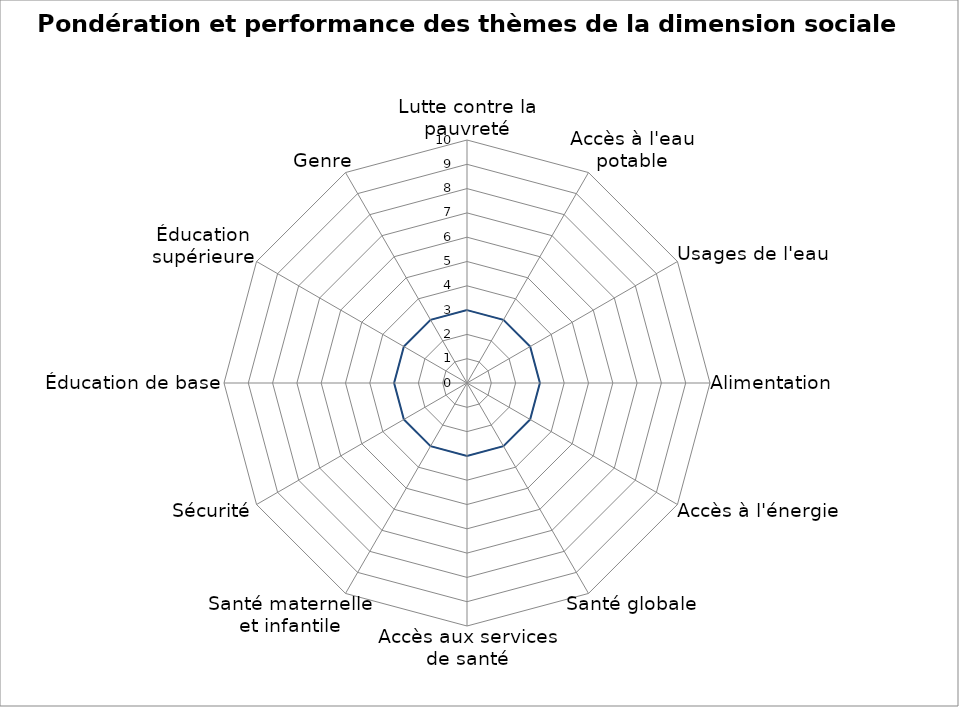
| Category | Performance | Pondération | Series 2 |
|---|---|---|---|
| Lutte contre la pauvreté | 0 | 0 | 3 |
| Accès à l'eau potable | 0 | 0 | 3 |
| Usages de l'eau | 0 | 0 | 3 |
| Alimentation | 0 | 0 | 3 |
| Accès à l'énergie | 0 | 0 | 3 |
| Santé globale | 0 | 0 | 3 |
| Accès aux services de santé | 0 | 0 | 3 |
| Santé maternelle et infantile | 0 | 0 | 3 |
| Sécurité | 0 | 0 | 3 |
| Éducation de base | 0 | 0 | 3 |
| Éducation supérieure | 0 | 0 | 3 |
| Genre | 0 | 0 | 3 |